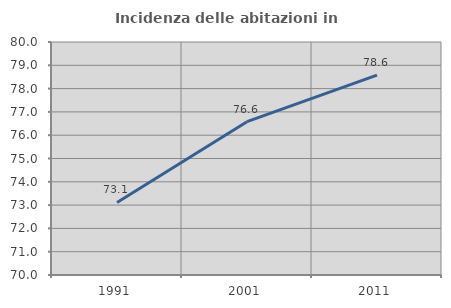
| Category | Incidenza delle abitazioni in proprietà  |
|---|---|
| 1991.0 | 73.115 |
| 2001.0 | 76.58 |
| 2011.0 | 78.575 |